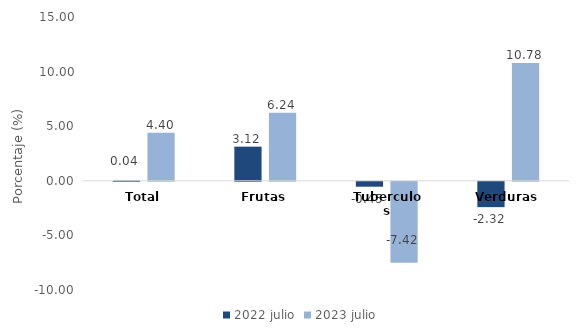
| Category | 2022 | 2023 |
|---|---|---|
| Total | 0.039 | 4.405 |
| Frutas | 3.125 | 6.236 |
| Tuberculos | -0.449 | -7.415 |
| Verduras | -2.32 | 10.779 |